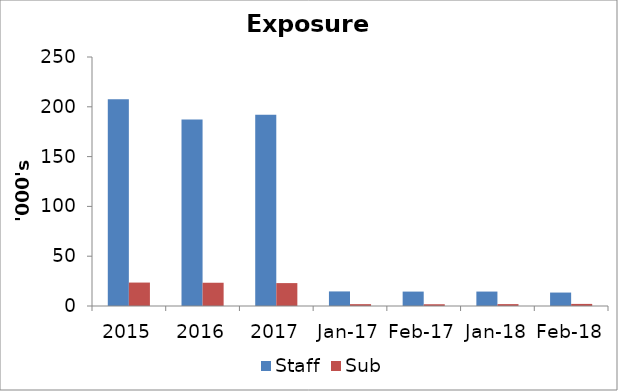
| Category | Staff | Sub |
|---|---|---|
| 2015.0 | 207536 | 23530 |
| 2016.0 | 187194 | 23350 |
| 2017.0 | 191925 | 23000 |
| 42736.0 | 14632 | 1855 |
| 42767.0 | 14473 | 1761 |
| 43101.0 | 14500 | 1900 |
| 43132.0 | 13500 | 2100 |